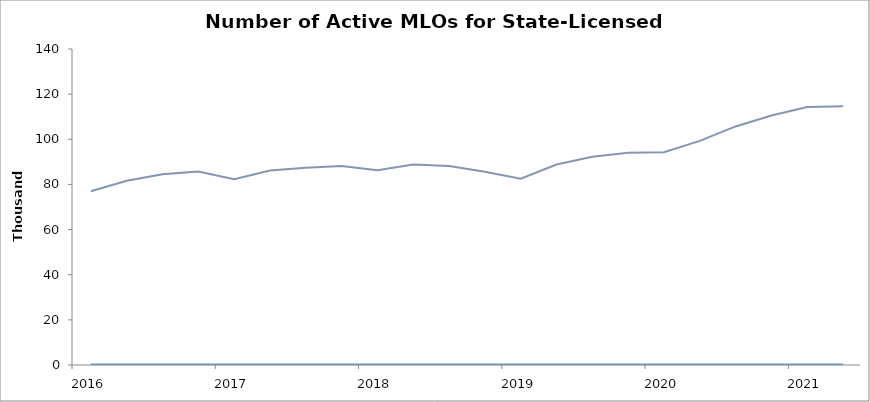
| Category | Quarter | Filing Quarter | Active MLOs |
|---|---|---|---|
| 2016 | 0 |  | 76959 |
| 2016 | 0 |  | 81606 |
| 2016 | 0 |  | 84484 |
| 2016 | 0 |  | 85755 |
| 2017 | 0 |  | 82276 |
| 2017 | 0 |  | 86190 |
| 2017 | 0 |  | 87405 |
| 2017 | 0 |  | 88205 |
| 2018 | 0 |  | 86269 |
| 2018 | 0 |  | 88855 |
| 2018 | 0 |  | 88147 |
| 2018 | 0 |  | 85647 |
| 2019 | 0 |  | 82551 |
| 2019 | 0 |  | 88832 |
| 2019 | 0 |  | 92249 |
| 2019 | 0 |  | 94070 |
| 2020 | 0 |  | 94304 |
| 2020 | 0 |  | 99308 |
| 2020 | 0 |  | 105690 |
| 2020 | 0 |  | 110569 |
| 2021 | 0 |  | 114340 |
| 2021 | 0 |  | 114669 |